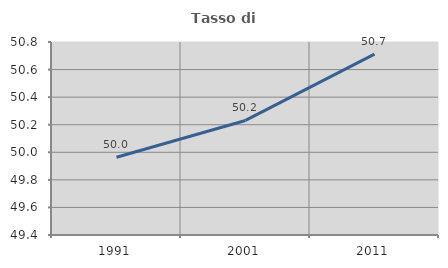
| Category | Tasso di occupazione   |
|---|---|
| 1991.0 | 49.964 |
| 2001.0 | 50.231 |
| 2011.0 | 50.712 |